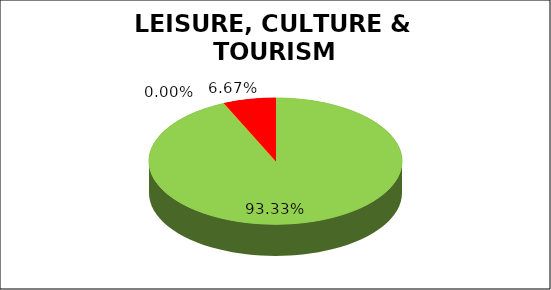
| Category | Q4 |
|---|---|
| Green | 0.933 |
| Amber | 0 |
| Red | 0.067 |